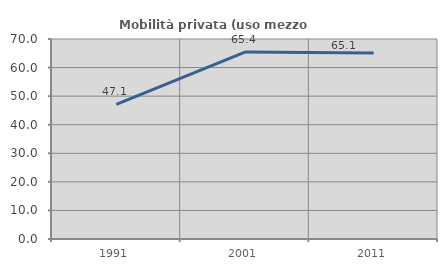
| Category | Mobilità privata (uso mezzo privato) |
|---|---|
| 1991.0 | 47.124 |
| 2001.0 | 65.43 |
| 2011.0 | 65.105 |